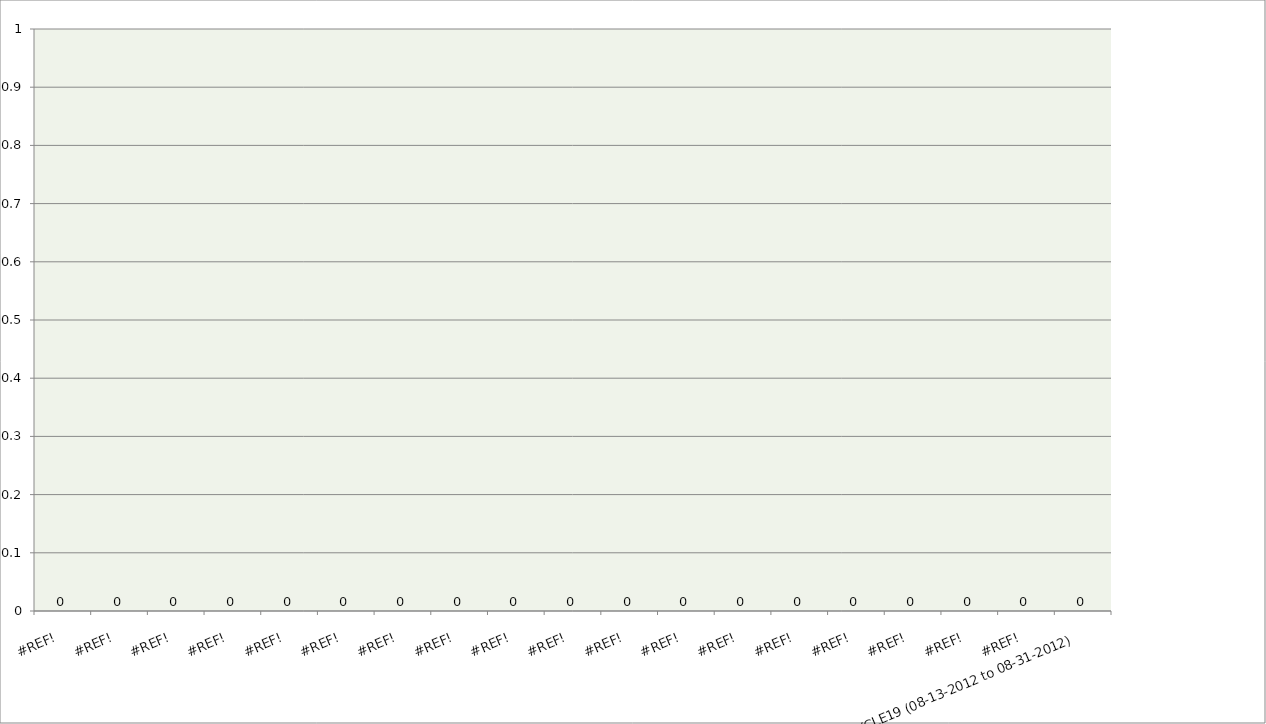
| Category | Series 0 |
|---|---|
| #REF! | 0 |
| #REF! | 0 |
| #REF! | 0 |
| #REF! | 0 |
| #REF! | 0 |
| #REF! | 0 |
| #REF! | 0 |
| #REF! | 0 |
| #REF! | 0 |
| #REF! | 0 |
| #REF! | 0 |
| #REF! | 0 |
| #REF! | 0 |
| #REF! | 0 |
| #REF! | 0 |
| #REF! | 0 |
| #REF! | 0 |
| #REF! | 0 |
| CYCLE19 (08-13-2012 to 08-31-2012) | 0 |